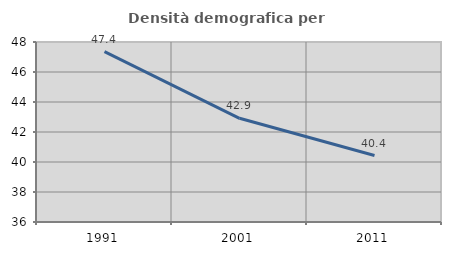
| Category | Densità demografica |
|---|---|
| 1991.0 | 47.359 |
| 2001.0 | 42.913 |
| 2011.0 | 40.431 |